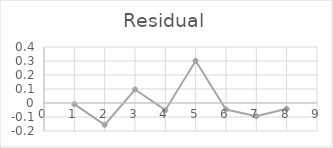
| Category | Residual |
|---|---|
| 1.0 | -0.008 |
| 2.0 | -0.156 |
| 3.0 | 0.096 |
| 4.0 | -0.051 |
| 5.0 | 0.301 |
| 6.0 | -0.046 |
| 7.0 | -0.094 |
| 8.0 | -0.042 |